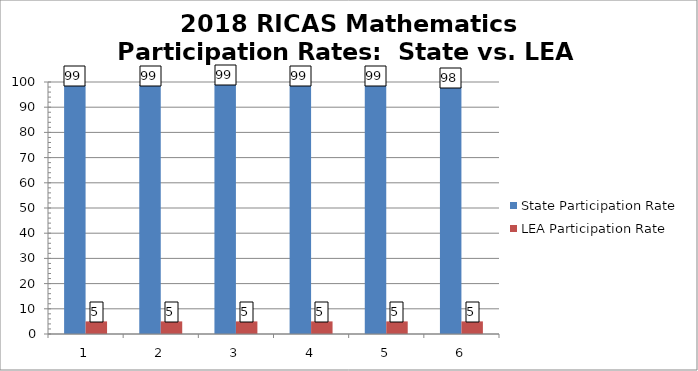
| Category | State Participation Rate | LEA Participation Rate |
|---|---|---|
| 0 | 98.7 | 5 |
| 1 | 98.9 | 5 |
| 2 | 99.1 | 5 |
| 3 | 98.9 | 5 |
| 4 | 98.8 | 5 |
| 5 | 98.2 | 5 |